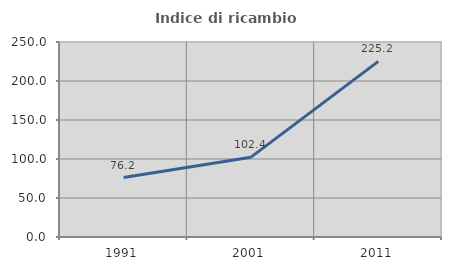
| Category | Indice di ricambio occupazionale  |
|---|---|
| 1991.0 | 76.214 |
| 2001.0 | 102.353 |
| 2011.0 | 225.21 |